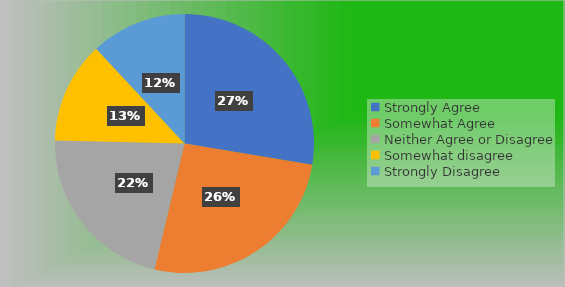
| Category | Series 0 |
|---|---|
| Strongly Agree | 37 |
| Somewhat Agree | 35 |
| Neither Agree or Disagree | 29 |
| Somewhat disagree | 17 |
| Strongly Disagree | 16 |